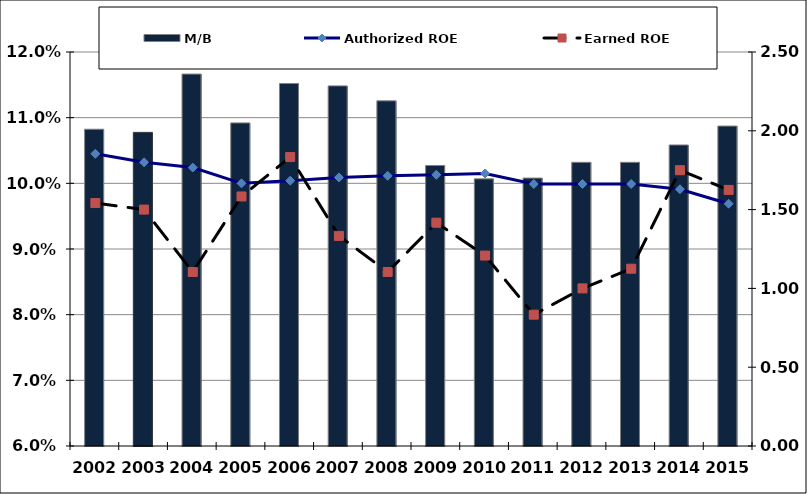
| Category | M/B |
|---|---|
| 2002.0 | 2.01 |
| 2003.0 | 1.99 |
| 2004.0 | 2.36 |
| 2005.0 | 2.05 |
| 2006.0 | 2.3 |
| 2007.0 | 2.285 |
| 2008.0 | 2.19 |
| 2009.0 | 1.78 |
| 2010.0 | 1.695 |
| 2011.0 | 1.7 |
| 2012.0 | 1.8 |
| 2013.0 | 1.8 |
| 2014.0 | 1.91 |
| 2015.0 | 2.03 |